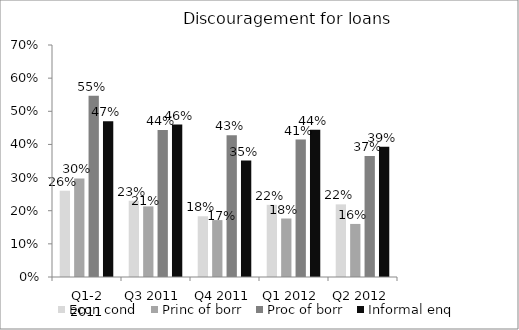
| Category | Econ cond | Princ of borr | Proc of borr | Informal enq |
|---|---|---|---|---|
| Q1-2 2011 | 0.26 | 0.297 | 0.547 | 0.47 |
| Q3 2011 | 0.23 | 0.213 | 0.443 | 0.46 |
| Q4 2011 | 0.183 | 0.172 | 0.427 | 0.351 |
| Q1 2012 | 0.218 | 0.176 | 0.415 | 0.444 |
| Q2 2012 | 0.219 | 0.16 | 0.365 | 0.393 |